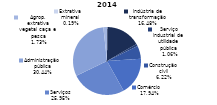
| Category | 2014 |
|---|---|
| Extrativa mineral | 972 |
| Indústria de transformação | 84785 |
| Serviço industrial de utilidade pública | 5464 |
| Construção civil | 31986 |
| Comércio | 92263 |
| Serviços | 133475 |
| Administração pública | 156560 |
| Agrop. extrativa vegetal caça e pesca | 8886 |